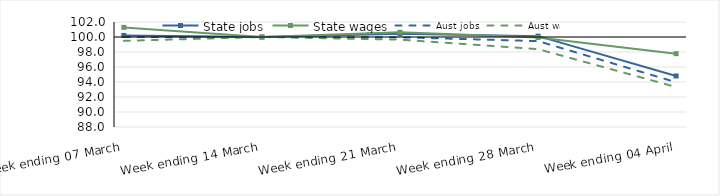
| Category | State jobs | State wages | Aust jobs | Aust wages |
|---|---|---|---|---|
| 2020-03-07 | 100.207 | 101.282 | 100.003 | 99.487 |
| 2020-03-14 | 100 | 100 | 100 | 100 |
| 2020-03-21 | 100.436 | 100.635 | 99.966 | 99.652 |
| 2020-03-28 | 100.115 | 99.935 | 99.451 | 98.382 |
| 2020-04-04 | 94.803 | 97.776 | 93.968 | 93.326 |